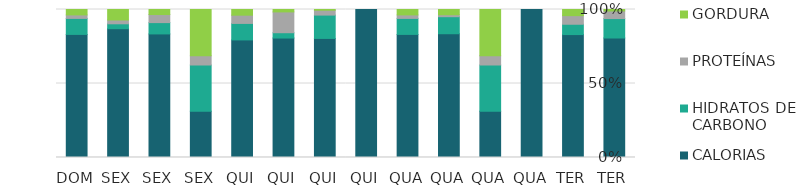
| Category | CALORIAS | HIDRATOS DE CARBONO | PROTEÍNAS | GORDURA |
|---|---|---|---|---|
| TER | 283 | 46 | 18 | 3.5 |
| TER | 500 | 42 | 35 | 25 |
| QUA | 1 | 0 | 0 | 0 |
| QUA | 10 | 10 | 2 | 10 |
| QUA | 189 | 26 | 3 | 8 |
| QUA | 477 | 62 | 13.5 | 21 |
| QUI | 1 | 0 | 0 | 0 |
| QUI | 245 | 48 | 10 | 1.5 |
| QUI | 247 | 11 | 43 | 5 |
| QUI | 456 | 64 | 32 | 22 |
| SEX | 10 | 10 | 2 | 10 |
| SEX | 135 | 12.36 | 8.81 | 5.51 |
| SEX | 184 | 7 | 5.43 | 15 |
| DOM | 477 | 62 | 13.5 | 21 |